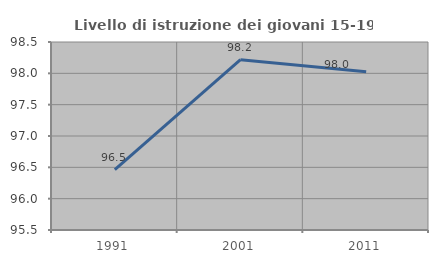
| Category | Livello di istruzione dei giovani 15-19 anni |
|---|---|
| 1991.0 | 96.465 |
| 2001.0 | 98.217 |
| 2011.0 | 98.024 |